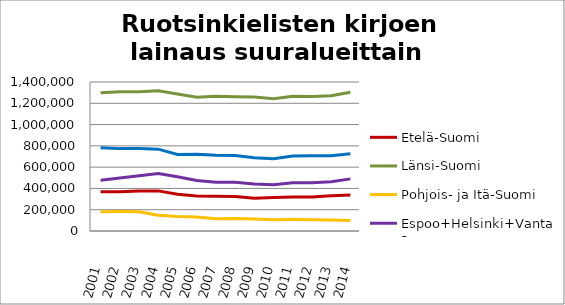
| Category | Etelä-Suomi | Länsi-Suomi | Pohjois- ja Itä-Suomi | Espoo+Helsinki+Vantaa | Muu Uusimaa |
|---|---|---|---|---|---|
| 2001.0 | 369481 | 1297908 | 181115 | 476248 | 782009 |
| 2002.0 | 368275 | 1307252 | 182545 | 498373 | 774007 |
| 2003.0 | 375897 | 1307441 | 181688 | 519939 | 776053 |
| 2004.0 | 376820 | 1317236 | 147306 | 540389 | 768923 |
| 2005.0 | 345545 | 1287716 | 136910 | 508824 | 719623 |
| 2006.0 | 327984 | 1256983 | 130652 | 474272 | 722126 |
| 2007.0 | 327353 | 1265646 | 115837 | 457141 | 711456 |
| 2008.0 | 324985 | 1262494 | 116901 | 458562 | 708659 |
| 2009.0 | 308423 | 1258219 | 111917 | 441682 | 687814 |
| 2010.0 | 313799 | 1243297 | 106130 | 433883 | 679595 |
| 2011.0 | 319167 | 1265042 | 107312 | 453455 | 704683 |
| 2012.0 | 318900 | 1262898 | 106505 | 452899 | 706736 |
| 2013.0 | 331221 | 1270266 | 103630 | 461795 | 707380 |
| 2014.0 | 337163 | 1302795 | 99233 | 489871 | 725099 |